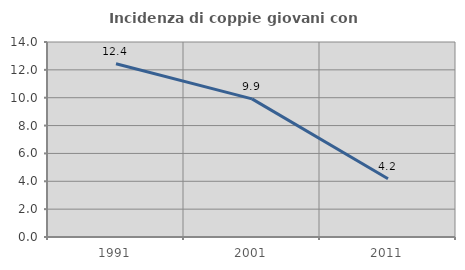
| Category | Incidenza di coppie giovani con figli |
|---|---|
| 1991.0 | 12.437 |
| 2001.0 | 9.92 |
| 2011.0 | 4.179 |